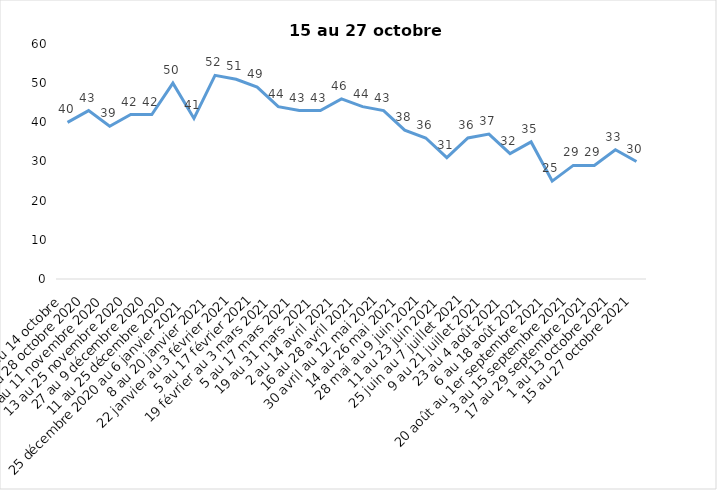
| Category | Toujours aux trois mesures |
|---|---|
| 2 au 14 octobre  | 40 |
| 16 au 28 octobre 2020 | 43 |
| 30 octobre au 11 novembre 2020 | 39 |
| 13 au 25 novembre 2020 | 42 |
| 27 au 9 décembre 2020 | 42 |
| 11 au 25 décembre 2020 | 50 |
| 25 décembre 2020 au 6 janvier 2021 | 41 |
| 8 au 20 janvier 2021 | 52 |
| 22 janvier au 3 février 2021 | 51 |
| 5 au 17 février 2021 | 49 |
| 19 février au 3 mars 2021 | 44 |
| 5 au 17 mars 2021 | 43 |
| 19 au 31 mars 2021 | 43 |
| 2 au 14 avril 2021 | 46 |
| 16 au 28 avril 2021 | 44 |
| 30 avril au 12 mai 2021 | 43 |
| 14 au 26 mai 2021 | 38 |
| 28 mai au 9 juin 2021 | 36 |
| 11 au 23 juin 2021 | 31 |
| 25 juin au 7 juillet 2021 | 36 |
| 9 au 21 juillet 2021 | 37 |
| 23 au 4 août 2021 | 32 |
| 6 au 18 août 2021 | 35 |
| 20 août au 1er septembre 2021 | 25 |
| 3 au 15 septembre 2021 | 29 |
| 17 au 29 septembre 2021 | 29 |
| 1 au 13 octobre 2021 | 33 |
| 15 au 27 octobre 2021 | 30 |